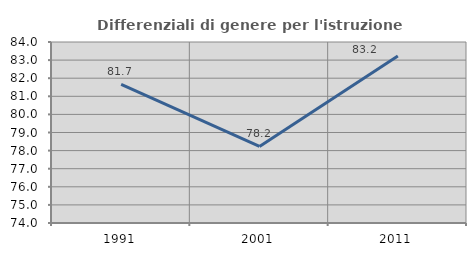
| Category | Differenziali di genere per l'istruzione superiore |
|---|---|
| 1991.0 | 81.653 |
| 2001.0 | 78.231 |
| 2011.0 | 83.223 |